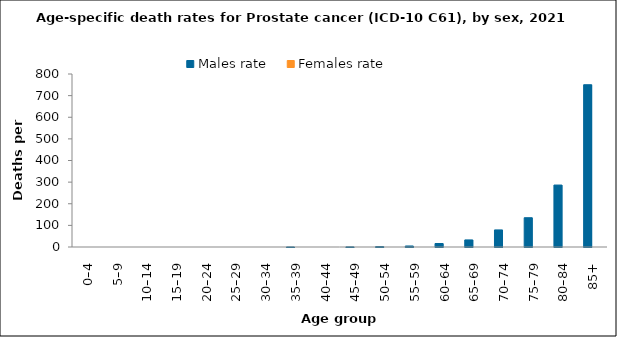
| Category | Males rate | Females rate |
|---|---|---|
| 0–4 | 0 | 0 |
| 5–9 | 0 | 0 |
| 10–14 | 0 | 0 |
| 15–19 | 0 | 0 |
| 20–24 | 0 | 0 |
| 25–29 | 0 | 0 |
| 30–34 | 0 | 0 |
| 35–39 | 0.108 | 0 |
| 40–44 | 0 | 0 |
| 45–49 | 0.489 | 0 |
| 50–54 | 2.015 | 0 |
| 55–59 | 4.721 | 0 |
| 60–64 | 16.17 | 0 |
| 65–69 | 32.711 | 0 |
| 70–74 | 78.963 | 0 |
| 75–79 | 135.364 | 0 |
| 80–84 | 286.444 | 0 |
| 85+ | 750.418 | 0 |